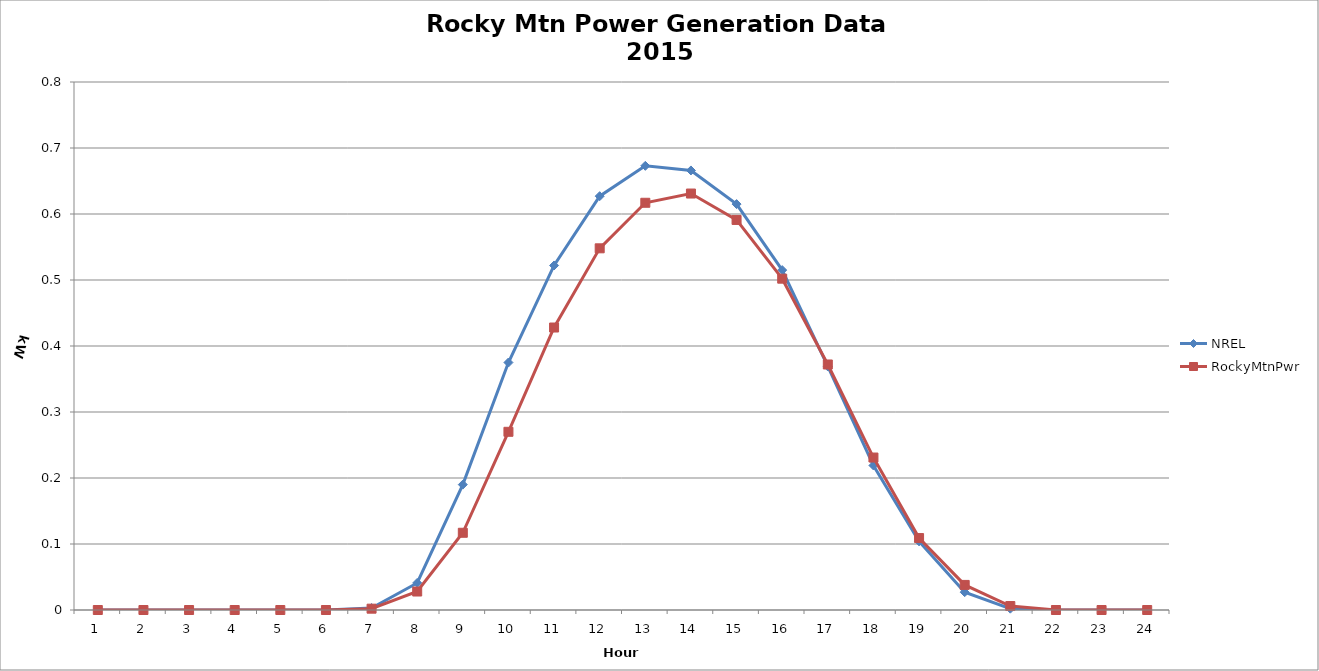
| Category | NREL | RockyMtnPwr |
|---|---|---|
| 0 | 0 | 0 |
| 1 | 0 | 0 |
| 2 | 0 | 0 |
| 3 | 0 | 0 |
| 4 | 0 | 0 |
| 5 | 0 | 0 |
| 6 | 0.003 | 0.002 |
| 7 | 0.041 | 0.028 |
| 8 | 0.19 | 0.117 |
| 9 | 0.375 | 0.27 |
| 10 | 0.522 | 0.428 |
| 11 | 0.627 | 0.548 |
| 12 | 0.673 | 0.617 |
| 13 | 0.666 | 0.631 |
| 14 | 0.615 | 0.591 |
| 15 | 0.515 | 0.502 |
| 16 | 0.369 | 0.372 |
| 17 | 0.219 | 0.231 |
| 18 | 0.104 | 0.109 |
| 19 | 0.027 | 0.038 |
| 20 | 0.002 | 0.006 |
| 21 | 0 | 0 |
| 22 | 0 | 0 |
| 23 | 0 | 0 |